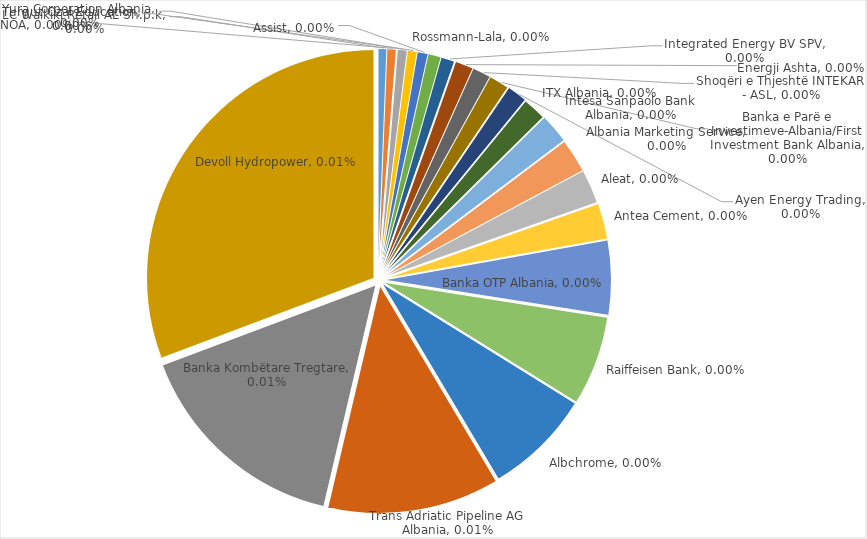
| Category | Pesha ndaj  Fitimit Total të 100 Kompanive më të Mëdha |
|---|---|
| LC Waikiki Retail AL Sh.p.k | 0 |
| NOA | 0 |
| Yura Corporation Albania | 0 |
| Turgut Ozal Education | 0 |
| Assist | 0 |
| Rossmann-Lala | 0 |
| Integrated Energy BV SPV | 0 |
| Energji Ashta | 0 |
| Shoqëri e Thjeshtë INTEKAR - ASL | 0 |
| Banka e Parë e Investimeve-Albania/First Investment Bank Albania | 0 |
| Ayen Energy Trading | 0 |
| ITX Albania | 0 |
| Intesa Sanpaolo Bank Albania | 0 |
| Albania Marketing Service | 0 |
| Aleat | 0 |
| Antea Cement | 0 |
| Banka OTP Albania | 0 |
| Raiffeisen Bank | 0 |
| Albchrome | 0 |
| Trans Adriatic Pipeline AG Albania | 0 |
| Banka Kombëtare Tregtare | 0 |
| Devoll Hydropower | 0 |